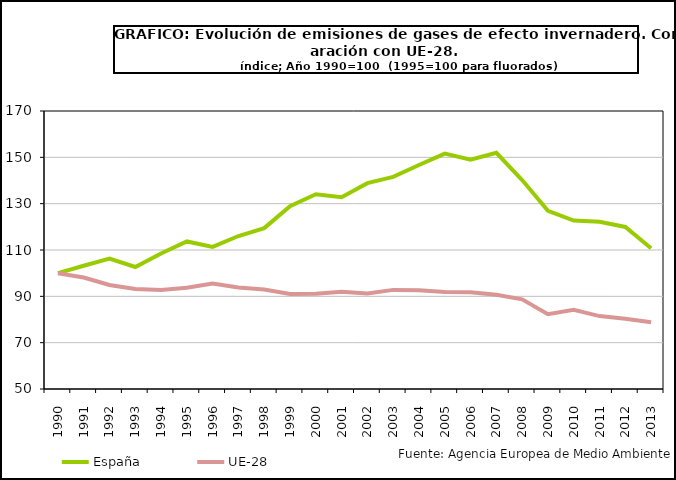
| Category | España | UE-28 |
|---|---|---|
| 1990.0 | 100 | 100 |
| 1991.0 | 103.216 | 98.136 |
| 1992.0 | 106.274 | 94.895 |
| 1993.0 | 102.662 | 93.204 |
| 1994.0 | 108.496 | 92.725 |
| 1995.0 | 113.694 | 93.687 |
| 1996.0 | 111.34 | 95.55 |
| 1997.0 | 116.038 | 93.797 |
| 1998.0 | 119.435 | 92.947 |
| 1999.0 | 128.941 | 91.005 |
| 2000.0 | 134.081 | 91.118 |
| 2001.0 | 132.814 | 91.98 |
| 2002.0 | 138.854 | 91.251 |
| 2003.0 | 141.553 | 92.787 |
| 2004.0 | 146.697 | 92.672 |
| 2005.0 | 151.622 | 91.922 |
| 2006.0 | 149.008 | 91.758 |
| 2007.0 | 151.933 | 90.684 |
| 2008.0 | 140.184 | 88.705 |
| 2009.0 | 126.924 | 82.32 |
| 2010.0 | 122.728 | 84.209 |
| 2011.0 | 122.182 | 81.469 |
| 2012.0 | 119.943 | 80.28 |
| 2013.0 | 110.753 | 78.773 |